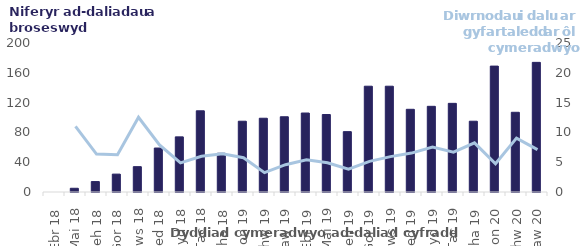
| Category | Nifer yr ad-daliadau a broseswyd |
|---|---|
| Ebr 18 | 0 |
| Mai 18 | 5 |
| Meh 18 | 14 |
| Gor 18 | 24 |
| Aws 18 | 34 |
| Med 18 | 59 |
| Hyd 18 | 74 |
| Tac 18 | 109 |
| Rha 18 | 52 |
| Ion 19 | 95 |
| Chw 19 | 99 |
| Maw 19 | 101 |
| Ebr 19 | 106 |
| Mai 19 | 104 |
| Meh 19 | 81 |
| Gor 19 | 142 |
| Aws 19 | 142 |
| Med 19 | 111 |
| Hyd 19 | 115 |
| Tac 19 | 119 |
| Rha 19 | 95 |
| Ion 20 | 169 |
| Chw 20 | 107 |
| Maw 20 | 174 |